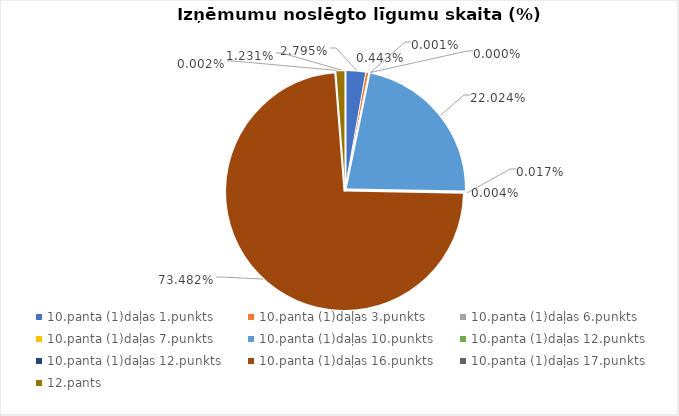
| Category | Īpatsvars (%) |
|---|---|
| 10.panta (1)daļas 1.punkts | 0.028 |
| 10.panta (1)daļas 3.punkts | 0.004 |
| 10.panta (1)daļas 6.punkts | 0 |
| 10.panta (1)daļas 7.punkts | 0 |
| 10.panta (1)daļas 10.punkts | 0.22 |
| 10.panta (1)daļas 12.punkts | 0 |
| 10.panta (1)daļas 12.punkts | 0 |
| 10.panta (1)daļas 16.punkts | 0.735 |
| 10.panta (1)daļas 17.punkts | 0 |
| 12.pants | 0.012 |